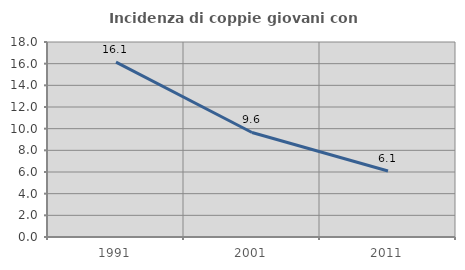
| Category | Incidenza di coppie giovani con figli |
|---|---|
| 1991.0 | 16.148 |
| 2001.0 | 9.647 |
| 2011.0 | 6.092 |